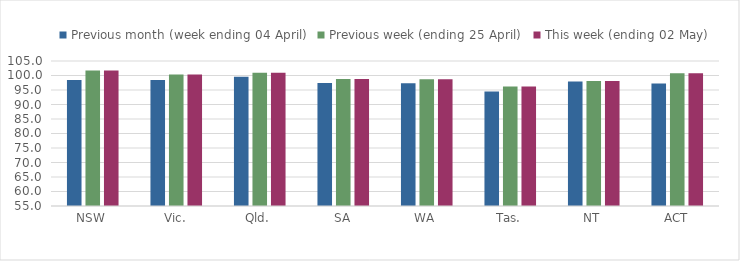
| Category | Previous month (week ending 04 April) | Previous week (ending 25 April) | This week (ending 02 May) |
|---|---|---|---|
| NSW | 98.489 | 101.744 | 101.744 |
| Vic. | 98.48 | 100.35 | 100.35 |
| Qld. | 99.612 | 100.92 | 100.92 |
| SA | 97.449 | 98.826 | 98.826 |
| WA | 97.309 | 98.697 | 98.697 |
| Tas. | 94.514 | 96.218 | 96.218 |
| NT | 97.946 | 98.124 | 98.124 |
| ACT | 97.229 | 100.738 | 100.738 |